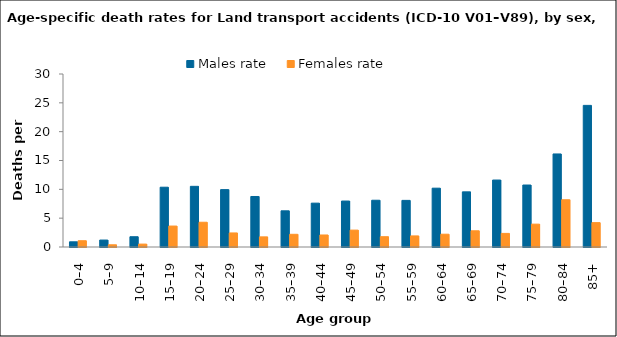
| Category | Males rate | Females rate |
|---|---|---|
| 0–4 | 0.901 | 1.087 |
| 5–9 | 1.206 | 0.383 |
| 10–14 | 1.781 | 0.502 |
| 15–19 | 10.369 | 3.633 |
| 20–24 | 10.521 | 4.294 |
| 25–29 | 9.951 | 2.437 |
| 30–34 | 8.759 | 1.756 |
| 35–39 | 6.274 | 2.201 |
| 40–44 | 7.603 | 2.086 |
| 45–49 | 7.969 | 2.929 |
| 50–54 | 8.109 | 1.786 |
| 55–59 | 8.085 | 1.922 |
| 60–64 | 10.199 | 2.217 |
| 65–69 | 9.565 | 2.812 |
| 70–74 | 11.612 | 2.358 |
| 75–79 | 10.748 | 3.963 |
| 80–84 | 16.136 | 8.192 |
| 85+ | 24.558 | 4.225 |